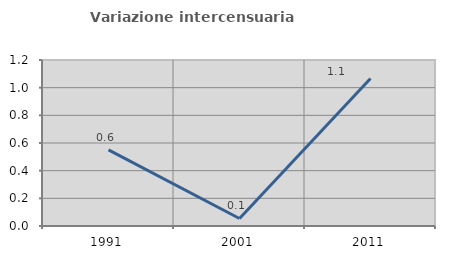
| Category | Variazione intercensuaria annua |
|---|---|
| 1991.0 | 0.551 |
| 2001.0 | 0.054 |
| 2011.0 | 1.066 |